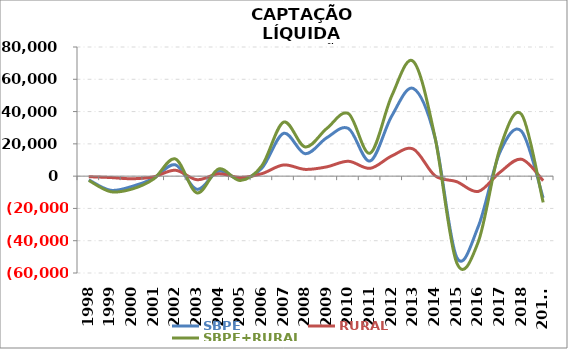
| Category | SBPE | RURAL | SBPE+RURAL |
|---|---|---|---|
| 1998 | -2301.5 | -361.228 | -2662.728 |
| 1999 | -8740.2 | -858.508 | -9598.708 |
| 2000 | -6355.964 | -1615.457 | -7971.421 |
| 2001 | -1319.381 | -412.963 | -1732.344 |
| 2002 | 7008.282 | 3649.972 | 10658.254 |
| 2003 | -8178.886 | -2213.868 | -10392.754 |
| 2004 | 3057.299 | 1425.147 | 4482.446 |
| 2005 | -1869.531 | -826.948 | -2696.479 |
| 2006 | 4963.736 | 1532.919 | 6496.655 |
| 2007 | 26493.6 | 6927.358 | 33420.958 |
| 2008 | 13900.71 | 4187.043 | 18087.753 |
| 2009 | 23813.033 | 5752.651 | 29565.684 |
| 2010 | 29513.472 | 9213.301 | 38726.773 |
| 2011 | 9382.932 | 4844.657 | 14227.589 |
| 2012 | 37239.575 | 12479.984 | 49719.559 |
| 2013 | 54280.749 | 16766.843 | 71047.592 |
| 2014 | 23758.558 | 275.423 | 24033.981 |
| 2015 | -50149.363 | -3418.504 | -53567.867 |
| 2016 | -31222.546 | -9479.207 | -40701.753 |
| 2017 | 14774.799 | 2351.903 | 17126.702 |
| 2018 | 27791.076 | 10469.293 | 38260.369 |
| 2019* | -13498.454 | -2779.958 | -16278.412 |